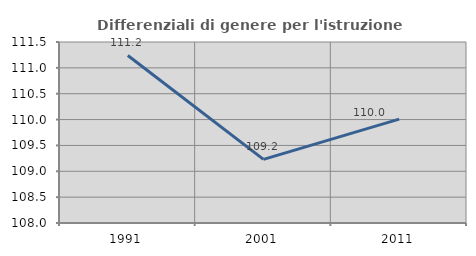
| Category | Differenziali di genere per l'istruzione superiore |
|---|---|
| 1991.0 | 111.239 |
| 2001.0 | 109.23 |
| 2011.0 | 110.008 |